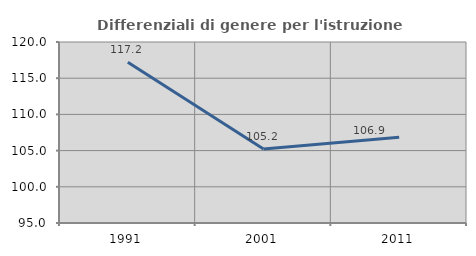
| Category | Differenziali di genere per l'istruzione superiore |
|---|---|
| 1991.0 | 117.206 |
| 2001.0 | 105.235 |
| 2011.0 | 106.86 |